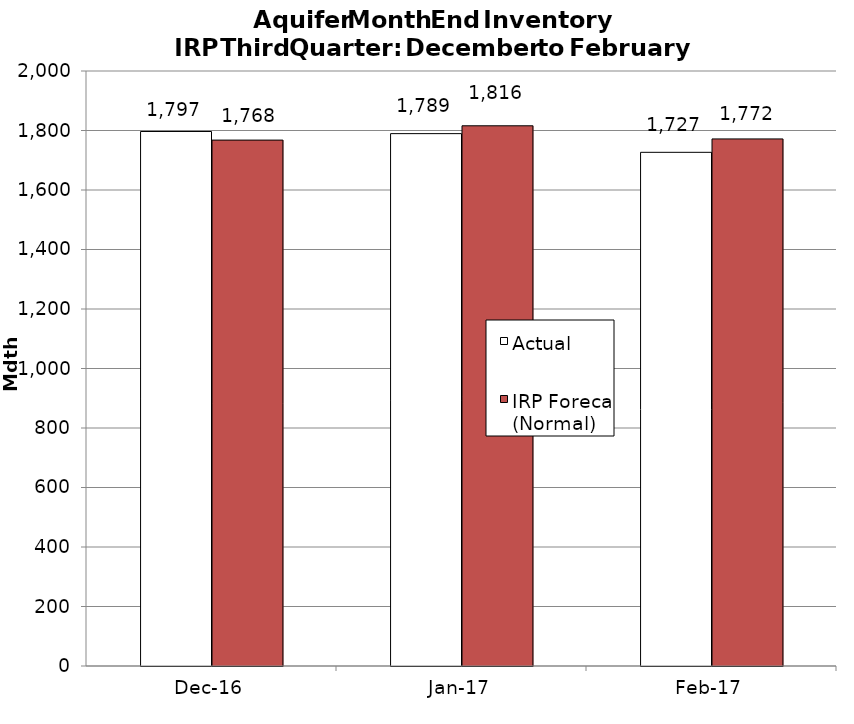
| Category | Actual | IRP Forecast (Normal) |
|---|---|---|
| 2016-12-01 | 1796.689 | 1767.729 |
| 2017-01-01 | 1789.486 | 1815.823 |
| 2017-02-01 | 1726.674 | 1771.657 |